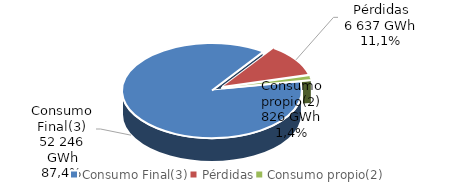
| Category |  GWh | % |
|---|---|---|
| Consumo Final(3) | 52246.176 | 0.874 |
| Pérdidas | 6636.784 | 0.111 |
| Consumo propio(2) | 825.632 | 0.014 |